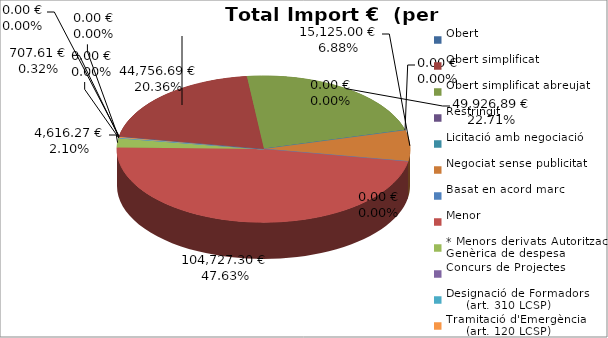
| Category | Total preu
(amb IVA) |
|---|---|
| Obert | 0 |
| Obert simplificat | 44756.69 |
| Obert simplificat abreujat | 49926.89 |
| Restringit | 0 |
| Licitació amb negociació | 0 |
| Negociat sense publicitat | 15125 |
| Basat en acord marc | 0 |
| Menor | 104727.3 |
| * Menors derivats Autorització Genèrica de despesa | 4616.27 |
| Concurs de Projectes | 0 |
| Designació de Formadors
     (art. 310 LCSP) | 0 |
| Tramitació d'Emergència
     (art. 120 LCSP) | 707.61 |